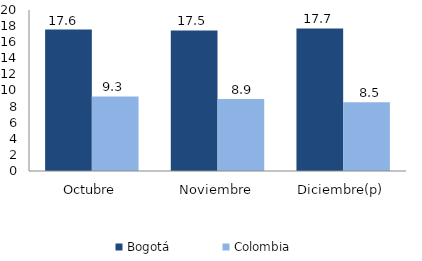
| Category | Bogotá | Colombia |
|---|---|---|
| Octubre | 17.572 | 9.268 |
| Noviembre | 17.459 | 8.941 |
| Diciembre(p) | 17.715 | 8.527 |